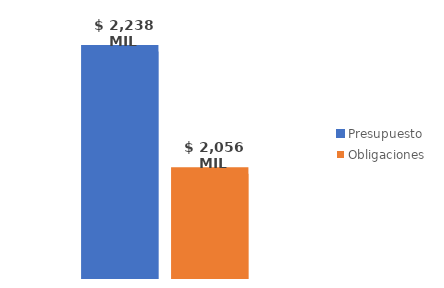
| Category | Presupuesto | Obligaciones |
|---|---|---|
| Total | 2237876088563.985 | 2055569490940.665 |